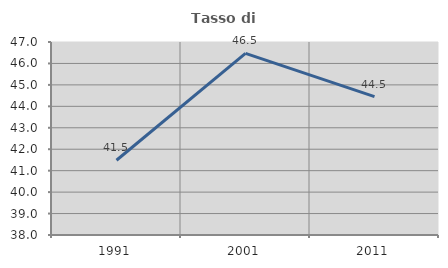
| Category | Tasso di occupazione   |
|---|---|
| 1991.0 | 41.486 |
| 2001.0 | 46.467 |
| 2011.0 | 44.454 |